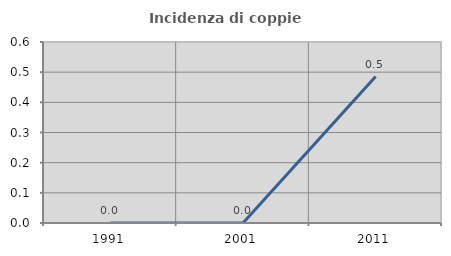
| Category | Incidenza di coppie miste |
|---|---|
| 1991.0 | 0 |
| 2001.0 | 0 |
| 2011.0 | 0.485 |